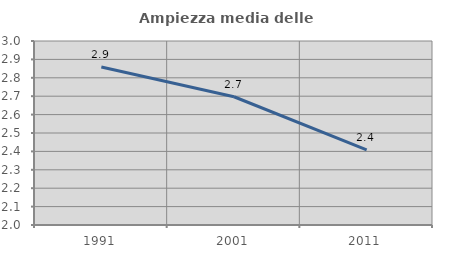
| Category | Ampiezza media delle famiglie |
|---|---|
| 1991.0 | 2.858 |
| 2001.0 | 2.697 |
| 2011.0 | 2.408 |